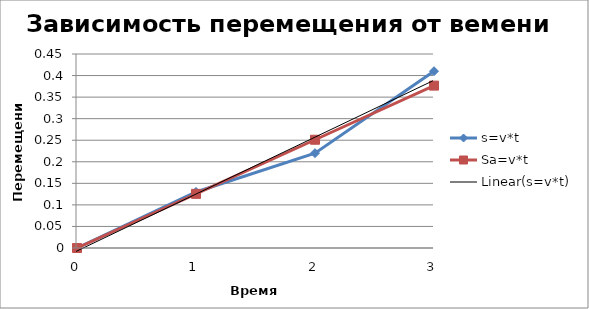
| Category | s=v*t | Sa=v*t |
|---|---|---|
| 0.0 | 0 | 0 |
| 1.0 | 0.13 | 0.126 |
| 2.0 | 0.22 | 0.251 |
| 3.0 | 0.41 | 0.377 |